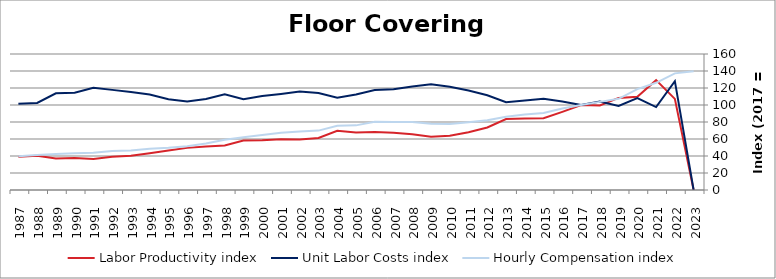
| Category | Labor Productivity index | Unit Labor Costs index | Hourly Compensation index |
|---|---|---|---|
| 2023.0 | 0 | 0 | 139.647 |
| 2022.0 | 107.166 | 128.027 | 137.201 |
| 2021.0 | 129.231 | 97.579 | 126.102 |
| 2020.0 | 109.801 | 108.136 | 118.735 |
| 2019.0 | 108.342 | 98.979 | 107.236 |
| 2018.0 | 99.49 | 104.215 | 103.683 |
| 2017.0 | 100 | 100 | 100 |
| 2016.0 | 91.933 | 104.175 | 95.771 |
| 2015.0 | 84.33 | 107.3 | 90.486 |
| 2014.0 | 84.21 | 105.394 | 88.753 |
| 2013.0 | 83.441 | 103.246 | 86.149 |
| 2012.0 | 73.592 | 111.47 | 82.033 |
| 2011.0 | 68.053 | 117.027 | 79.64 |
| 2010.0 | 63.908 | 121.341 | 77.547 |
| 2009.0 | 62.681 | 124.325 | 77.927 |
| 2008.0 | 65.571 | 121.88 | 79.918 |
| 2007.0 | 67.401 | 118.573 | 79.919 |
| 2006.0 | 68.173 | 117.657 | 80.21 |
| 2005.0 | 67.624 | 112.455 | 76.047 |
| 2004.0 | 69.662 | 108.502 | 75.584 |
| 2003.0 | 61.205 | 114.149 | 69.865 |
| 2002.0 | 59.329 | 115.782 | 68.693 |
| 2001.0 | 59.642 | 112.926 | 67.351 |
| 2000.0 | 58.614 | 110.489 | 64.762 |
| 1999.0 | 58.165 | 106.915 | 62.187 |
| 1998.0 | 52.474 | 112.578 | 59.074 |
| 1997.0 | 51.183 | 107.084 | 54.809 |
| 1996.0 | 49.559 | 104.015 | 51.549 |
| 1995.0 | 46.449 | 106.718 | 49.57 |
| 1994.0 | 43.263 | 112.304 | 48.586 |
| 1993.0 | 40.169 | 115.394 | 46.353 |
| 1992.0 | 39.047 | 117.796 | 45.995 |
| 1991.0 | 36.491 | 120.3 | 43.899 |
| 1990.0 | 37.671 | 114.413 | 43.101 |
| 1989.0 | 37.184 | 113.727 | 42.288 |
| 1988.0 | 40.297 | 102.482 | 41.297 |
| 1987.0 | 39.1 | 101.441 | 39.663 |